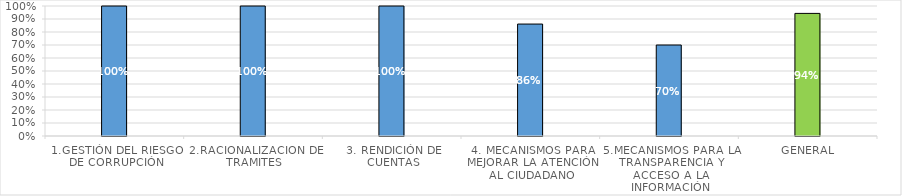
| Category | Series 0 |
|---|---|
| 1.GESTIÓN DEL RIESGO DE CORRUPCIÓN | 1 |
| 2.RACIONALIZACION DE TRAMITES | 1 |
| 3. RENDICIÓN DE CUENTAS | 1 |
| 4. MECANISMOS PARA MEJORAR LA ATENCIÓN AL CIUDADANO | 0.861 |
| 5.MECANISMOS PARA LA TRANSPARENCIA Y ACCESO A LA INFORMACIÓN | 0.7 |
| GENERAL | 0.943 |